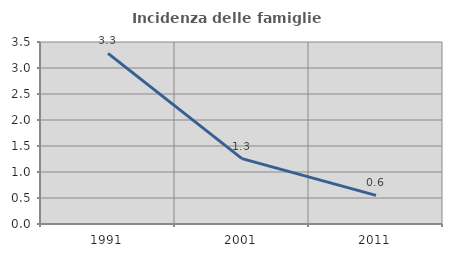
| Category | Incidenza delle famiglie numerose |
|---|---|
| 1991.0 | 3.28 |
| 2001.0 | 1.258 |
| 2011.0 | 0.551 |